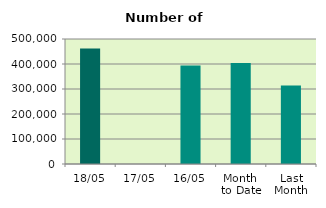
| Category | Series 0 |
|---|---|
| 18/05 | 462102 |
| 17/05 | 0 |
| 16/05 | 394402 |
| Month 
to Date | 404434.667 |
| Last
Month | 313751.158 |